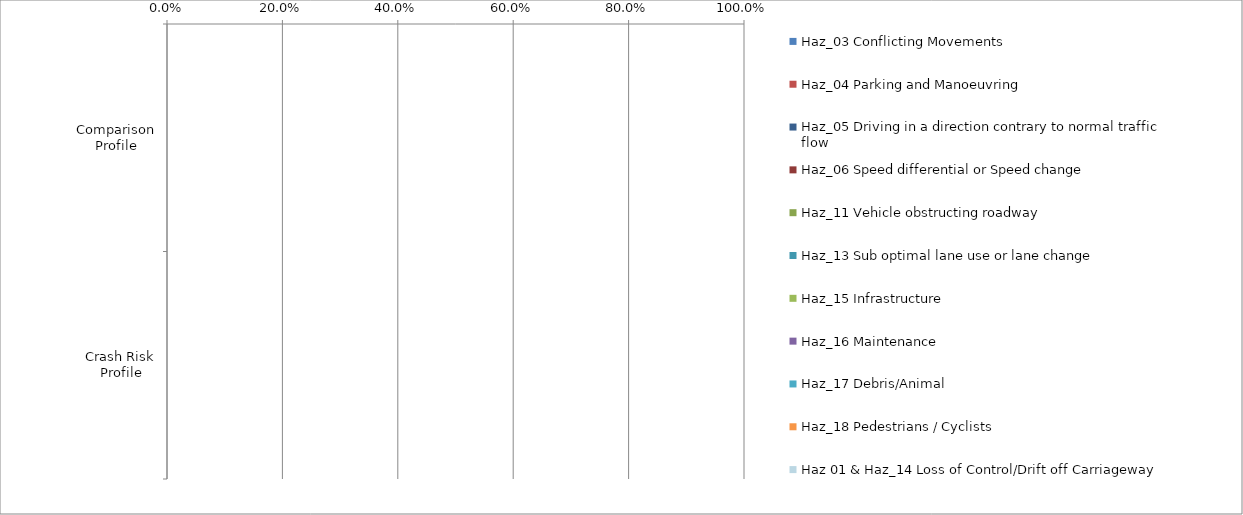
| Category | Haz_03 Conflicting Movements | Haz_04 Parking and Manoeuvring | Haz_05 Driving in a direction contrary to normal traffic flow | Haz_06 Speed differential or Speed change | Haz_11 Vehicle obstructing roadway | Haz_13 Sub optimal lane use or lane change | Haz_15 Infrastructure | Haz_16 Maintenance | Haz_17 Debris/Animal | Haz_18 Pedestrians / Cyclists | Haz 01 & Haz_14 Loss of Control/Drift off Carriageway |
|---|---|---|---|---|---|---|---|---|---|---|---|
| Comparison Profile | 0 | 0 | 0 | 0 | 0 | 0 | 0 | 0 | 0 | 0 | 0 |
| Crash Risk Profile | 0 | 0 | 0 | 0 | 0 | 0 | 0 | 0 | 0 | 0 | 0 |